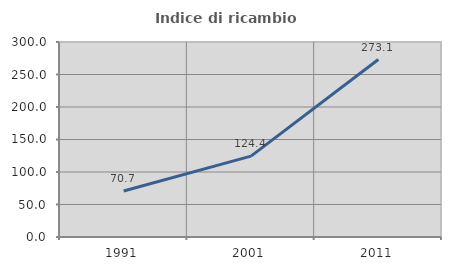
| Category | Indice di ricambio occupazionale  |
|---|---|
| 1991.0 | 70.707 |
| 2001.0 | 124.39 |
| 2011.0 | 273.077 |